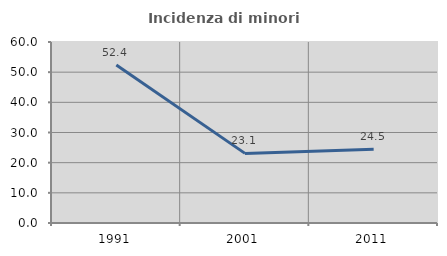
| Category | Incidenza di minori stranieri |
|---|---|
| 1991.0 | 52.381 |
| 2001.0 | 23.077 |
| 2011.0 | 24.457 |